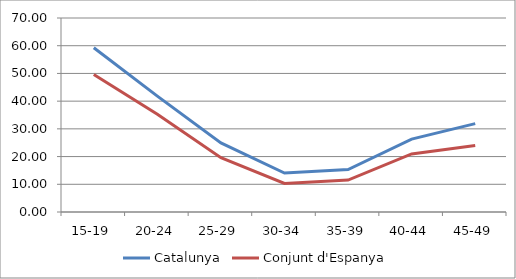
| Category | Catalunya | Conjunt d'Espanya |
|---|---|---|
| 15-19 | 59.285 | 49.588 |
| 20-24 | 41.814 | 35.271 |
| 25-29 | 24.905 | 19.571 |
| 30-34 | 14.041 | 10.278 |
| 35-39 | 15.321 | 11.517 |
| 40-44 | 26.314 | 20.956 |
| 45-49 | 31.894 | 24.007 |